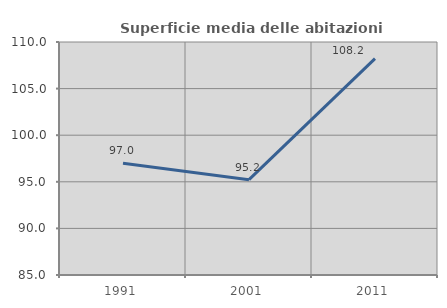
| Category | Superficie media delle abitazioni occupate |
|---|---|
| 1991.0 | 96.99 |
| 2001.0 | 95.225 |
| 2011.0 | 108.211 |